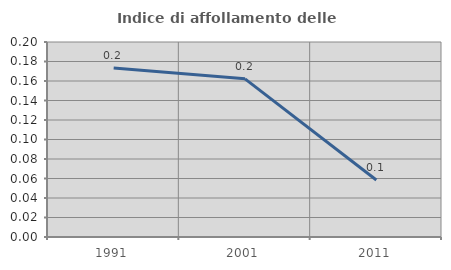
| Category | Indice di affollamento delle abitazioni  |
|---|---|
| 1991.0 | 0.173 |
| 2001.0 | 0.162 |
| 2011.0 | 0.058 |